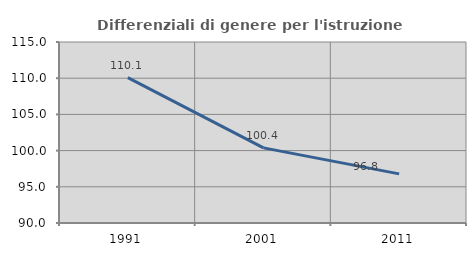
| Category | Differenziali di genere per l'istruzione superiore |
|---|---|
| 1991.0 | 110.076 |
| 2001.0 | 100.374 |
| 2011.0 | 96.786 |